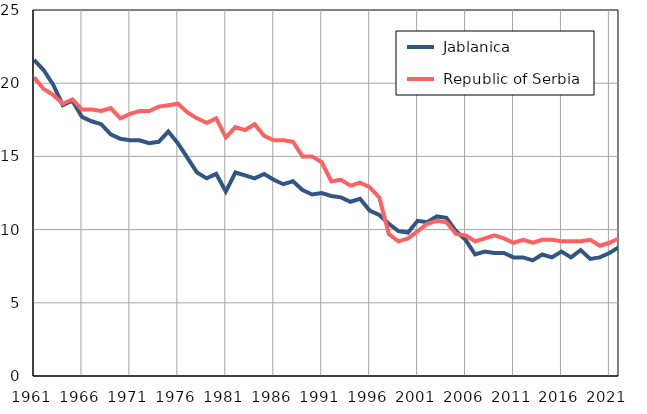
| Category |  Jablanica |  Republic of Serbia |
|---|---|---|
| 1961.0 | 21.6 | 20.4 |
| 1962.0 | 20.9 | 19.6 |
| 1963.0 | 19.9 | 19.2 |
| 1964.0 | 18.5 | 18.6 |
| 1965.0 | 18.8 | 18.9 |
| 1966.0 | 17.7 | 18.2 |
| 1967.0 | 17.4 | 18.2 |
| 1968.0 | 17.2 | 18.1 |
| 1969.0 | 16.5 | 18.3 |
| 1970.0 | 16.2 | 17.6 |
| 1971.0 | 16.1 | 17.9 |
| 1972.0 | 16.1 | 18.1 |
| 1973.0 | 15.9 | 18.1 |
| 1974.0 | 16 | 18.4 |
| 1975.0 | 16.7 | 18.5 |
| 1976.0 | 15.9 | 18.6 |
| 1977.0 | 14.9 | 18 |
| 1978.0 | 13.9 | 17.6 |
| 1979.0 | 13.5 | 17.3 |
| 1980.0 | 13.8 | 17.6 |
| 1981.0 | 12.6 | 16.3 |
| 1982.0 | 13.9 | 17 |
| 1983.0 | 13.7 | 16.8 |
| 1984.0 | 13.5 | 17.2 |
| 1985.0 | 13.8 | 16.4 |
| 1986.0 | 13.4 | 16.1 |
| 1987.0 | 13.1 | 16.1 |
| 1988.0 | 13.3 | 16 |
| 1989.0 | 12.7 | 15 |
| 1990.0 | 12.4 | 15 |
| 1991.0 | 12.5 | 14.6 |
| 1992.0 | 12.3 | 13.3 |
| 1993.0 | 12.2 | 13.4 |
| 1994.0 | 11.9 | 13 |
| 1995.0 | 12.1 | 13.2 |
| 1996.0 | 11.3 | 12.9 |
| 1997.0 | 11 | 12.2 |
| 1998.0 | 10.4 | 9.7 |
| 1999.0 | 9.9 | 9.2 |
| 2000.0 | 9.8 | 9.4 |
| 2001.0 | 10.6 | 9.9 |
| 2002.0 | 10.5 | 10.4 |
| 2003.0 | 10.9 | 10.6 |
| 2004.0 | 10.8 | 10.5 |
| 2005.0 | 9.9 | 9.7 |
| 2006.0 | 9.3 | 9.6 |
| 2007.0 | 8.3 | 9.2 |
| 2008.0 | 8.5 | 9.4 |
| 2009.0 | 8.4 | 9.6 |
| 2010.0 | 8.4 | 9.4 |
| 2011.0 | 8.1 | 9.1 |
| 2012.0 | 8.1 | 9.3 |
| 2013.0 | 7.9 | 9.1 |
| 2014.0 | 8.3 | 9.3 |
| 2015.0 | 8.1 | 9.3 |
| 2016.0 | 8.5 | 9.2 |
| 2017.0 | 8.1 | 9.2 |
| 2018.0 | 8.6 | 9.2 |
| 2019.0 | 8 | 9.3 |
| 2020.0 | 8.1 | 8.9 |
| 2021.0 | 8.4 | 9.1 |
| 2022.0 | 8.8 | 9.4 |